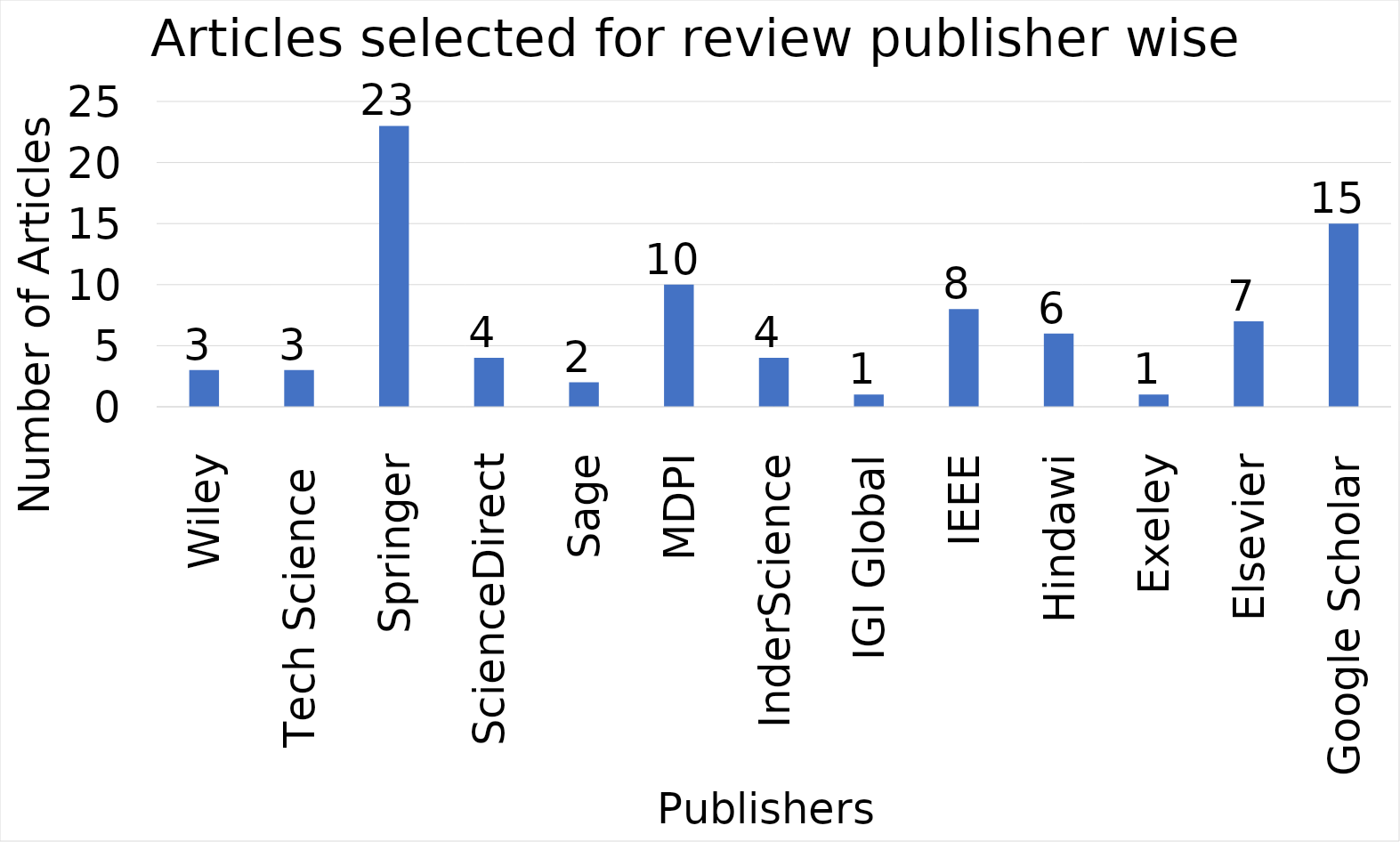
| Category | Number of Papers |
|---|---|
| Wiley | 3 |
| Tech Science  | 3 |
| Springer | 23 |
| ScienceDirect | 4 |
| Sage | 2 |
| MDPI | 10 |
| InderScience | 4 |
| IGI Global | 1 |
| IEEE | 8 |
| Hindawi | 6 |
| Exeley | 1 |
| Elsevier | 7 |
| Google Scholar | 15 |